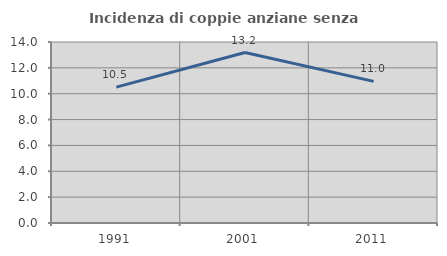
| Category | Incidenza di coppie anziane senza figli  |
|---|---|
| 1991.0 | 10.508 |
| 2001.0 | 13.184 |
| 2011.0 | 10.955 |